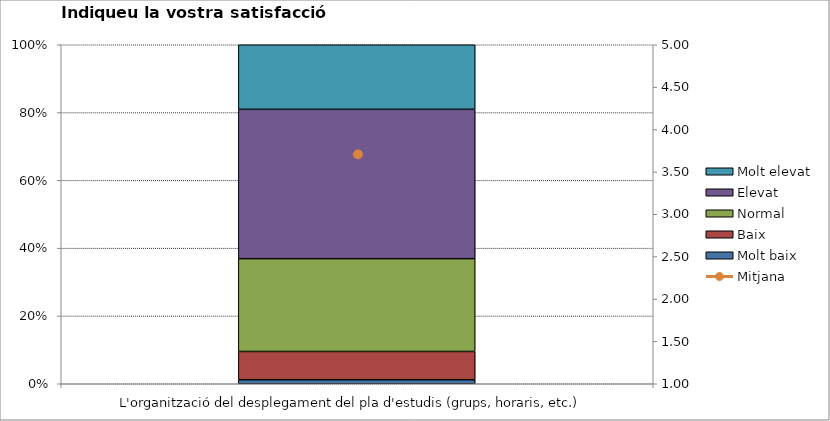
| Category | Molt baix | Baix | Normal  | Elevat | Molt elevat |
|---|---|---|---|---|---|
| L'organització del desplegament del pla d'estudis (grups, horaris, etc.) | 1 | 7 | 23 | 37 | 16 |